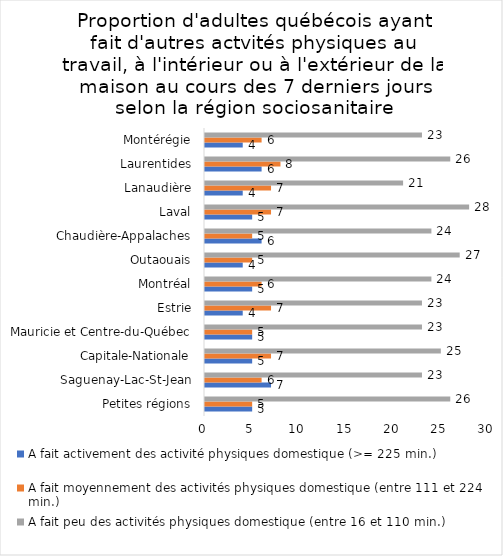
| Category | A fait activement des activité physiques domestique (>= 225 min.) | A fait moyennement des activités physiques domestique (entre 111 et 224 min.) | A fait peu des activités physiques domestique (entre 16 et 110 min.) |
|---|---|---|---|
| Petites régions | 5 | 5 | 26 |
| Saguenay-Lac-St-Jean | 7 | 6 | 23 |
| Capitale-Nationale | 5 | 7 | 25 |
| Mauricie et Centre-du-Québec | 5 | 5 | 23 |
| Estrie | 4 | 7 | 23 |
| Montréal | 5 | 6 | 24 |
| Outaouais | 4 | 5 | 27 |
| Chaudière-Appalaches | 6 | 5 | 24 |
| Laval | 5 | 7 | 28 |
| Lanaudière | 4 | 7 | 21 |
| Laurentides | 6 | 8 | 26 |
| Montérégie | 4 | 6 | 23 |